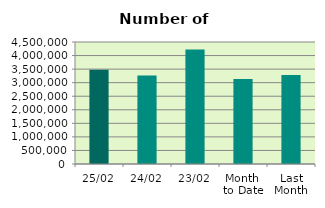
| Category | Series 0 |
|---|---|
| 25/02 | 3473222 |
| 24/02 | 3260384 |
| 23/02 | 4218822 |
| Month 
to Date | 3139706.737 |
| Last
Month | 3281385.4 |